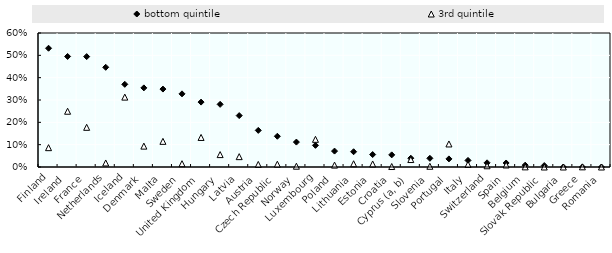
| Category | bottom quintile | 3rd quintile |
|---|---|---|
| Finland | 0.532 | 0.087 |
| Ireland | 0.495 | 0.25 |
| France | 0.494 | 0.178 |
| Netherlands | 0.446 | 0.018 |
| Iceland | 0.37 | 0.313 |
| Denmark | 0.354 | 0.093 |
| Malta | 0.349 | 0.115 |
| Sweden | 0.328 | 0.015 |
| United Kingdom | 0.291 | 0.132 |
| Hungary | 0.281 | 0.055 |
| Latvia | 0.23 | 0.046 |
| Austria | 0.164 | 0.012 |
| Czech Republic | 0.138 | 0.012 |
| Norway | 0.112 | 0.004 |
| Luxembourg | 0.097 | 0.124 |
| Poland | 0.071 | 0.008 |
| Lithuania | 0.068 | 0.015 |
| Estonia | 0.056 | 0.014 |
| Croatia | 0.054 | 0.002 |
| Cyprus (a, b) | 0.039 | 0.033 |
| Slovenia | 0.039 | 0.003 |
| Portugal | 0.036 | 0.103 |
| Italy | 0.029 | 0.011 |
| Switzerland | 0.019 | 0.005 |
| Spain | 0.018 | 0.009 |
| Belgium | 0.008 | 0.001 |
| Slovak Republic | 0.007 | 0 |
| Bulgaria | 0 | 0 |
| Greece | 0 | 0.001 |
| Romania | 0 | 0 |